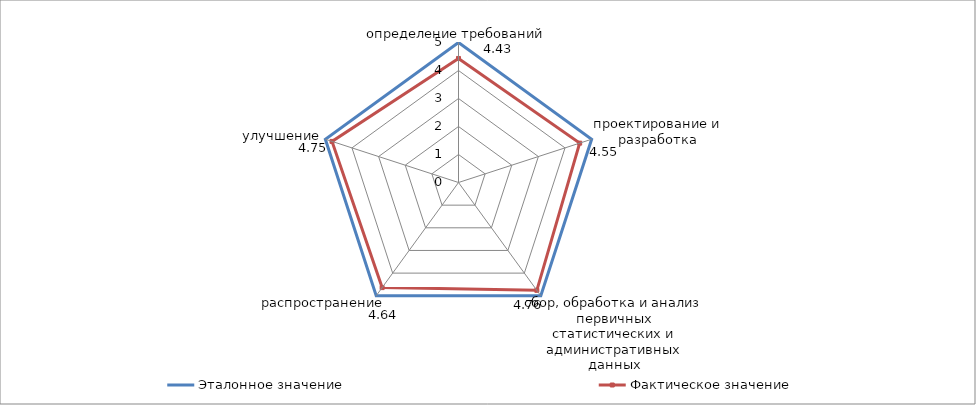
| Category | Эталонное значение | Фактическое значение |
|---|---|---|
| определение требований | 5 | 4.43 |
| проектирование и разработка | 5 | 4.55 |
| сбор, обработка и анализ первичных статистических и административных данных | 5 | 4.76 |
| распространение | 5 | 4.64 |
| улучшение | 5 | 4.75 |